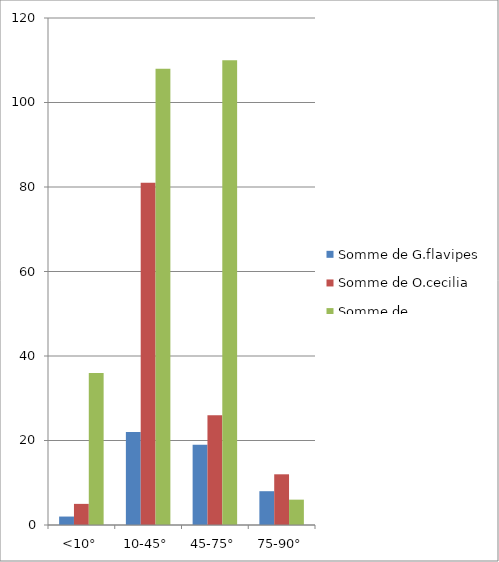
| Category | Somme de G.flavipes | Somme de O.cecilia | Somme de O.forcipatus |
|---|---|---|---|
| <10° | 2 | 5 | 36 |
| 10-45° | 22 | 81 | 108 |
| 45-75° | 19 | 26 | 110 |
| 75-90° | 8 | 12 | 6 |